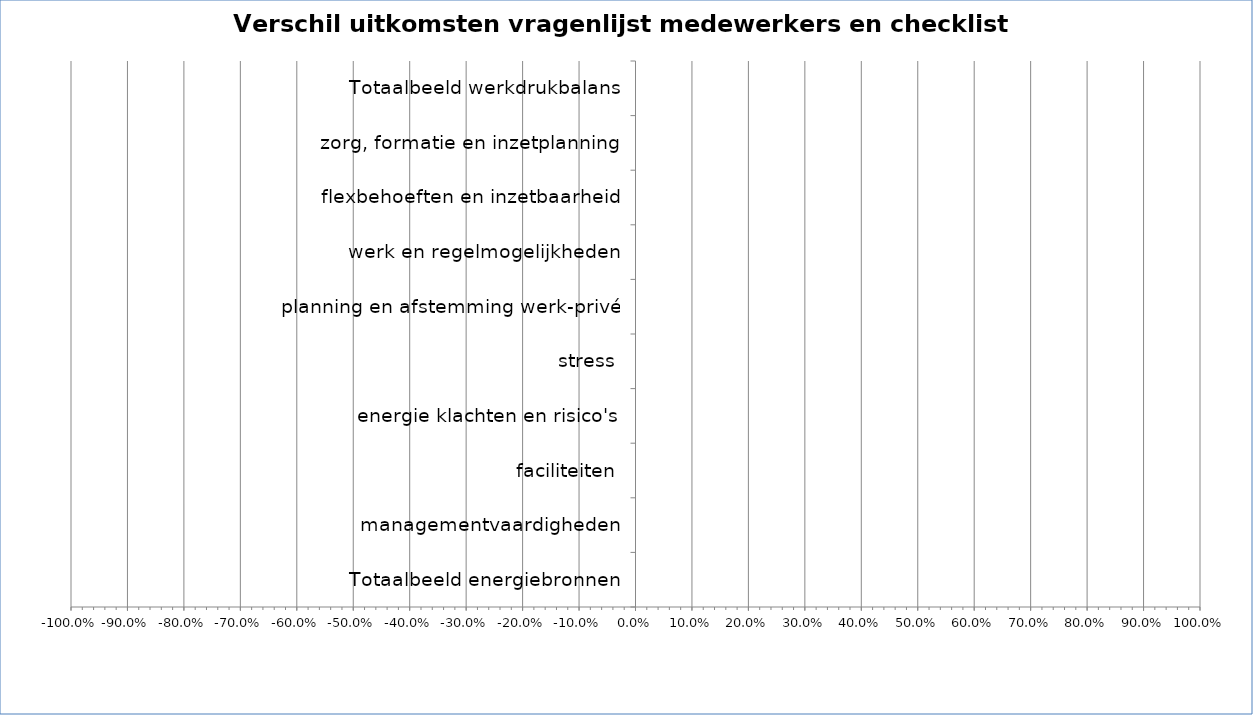
| Category | verschil vragenlijst - checklist |
|---|---|
| Totaalbeeld werkdrukbalans | 0 |
| zorg, formatie en inzetplanning | 0 |
| flexbehoeften en inzetbaarheid | 0 |
| werk en regelmogelijkheden | 0 |
| planning en afstemming werk-privé | 0 |
| stress | 0 |
| energie klachten en risico's | 0 |
| faciliteiten | 0 |
| managementvaardigheden | 0 |
| Totaalbeeld energiebronnen | 0 |